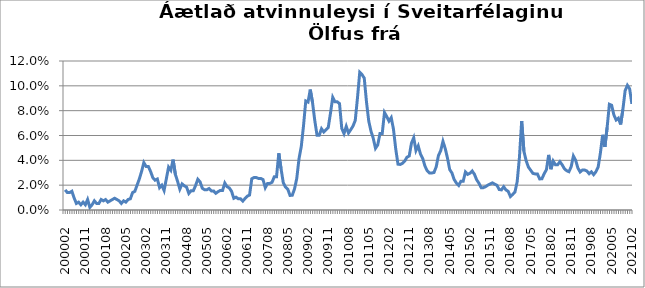
| Category | Series 0 |
|---|---|
| 200002 | 0.016 |
| 200003 | 0.014 |
| 200004 | 0.014 |
| 200005 | 0.015 |
| 200006 | 0.01 |
| 200007 | 0.005 |
| 200008 | 0.006 |
| 200009 | 0.004 |
| 200010 | 0.006 |
| 200011 | 0.004 |
| 200012 | 0.008 |
| 200101 | 0.002 |
| 200102 | 0.004 |
| 200103 | 0.007 |
| 200104 | 0.005 |
| 200105 | 0.005 |
| 200106 | 0.008 |
| 200107 | 0.007 |
| 200108 | 0.008 |
| 200109 | 0.006 |
| 200110 | 0.007 |
| 200111 | 0.008 |
| 200112 | 0.009 |
| 200201 | 0.008 |
| 200202 | 0.007 |
| 200203 | 0.005 |
| 200204 | 0.007 |
| 200205 | 0.006 |
| 200206 | 0.008 |
| 200207 | 0.009 |
| 200208 | 0.014 |
| 200209 | 0.015 |
| 200210 | 0.02 |
| 200211 | 0.025 |
| 200212 | 0.031 |
| 200301 | 0.038 |
| 200302 | 0.035 |
| 200303 | 0.035 |
| 200304 | 0.031 |
| 200305 | 0.026 |
| 200306 | 0.024 |
| 200307 | 0.025 |
| 200308 | 0.018 |
| 200309 | 0.02 |
| 200310 | 0.016 |
| 200311 | 0.025 |
| 200312 | 0.035 |
| 200401 | 0.032 |
| 200402 | 0.041 |
| 200403 | 0.029 |
| 200404 | 0.023 |
| 200405 | 0.017 |
| 200406 | 0.021 |
| 200407 | 0.019 |
| 200408 | 0.018 |
| 200409 | 0.013 |
| 200410 | 0.016 |
| 200411 | 0.016 |
| 200412 | 0.02 |
| 200501 | 0.025 |
| 200502 | 0.023 |
| 200503 | 0.018 |
| 200504 | 0.016 |
| 200505 | 0.016 |
| 200506 | 0.017 |
| 200507 | 0.015 |
| 200508 | 0.015 |
| 200509 | 0.013 |
| 200510 | 0.015 |
| 200511 | 0.016 |
| 200512 | 0.016 |
| 200601 | 0.022 |
| 200602 | 0.019 |
| 200603 | 0.018 |
| 200604 | 0.015 |
| 200605 | 0.009 |
| 200606 | 0.01 |
| 200607 | 0.009 |
| 200608 | 0.009 |
| 200609 | 0.007 |
| 200610 | 0.009 |
| 200611 | 0.011 |
| 200612 | 0.012 |
| 200701 | 0.025 |
| 200702 | 0.026 |
| 200703 | 0.026 |
| 200704 | 0.025 |
| 200705 | 0.025 |
| 200706 | 0.024 |
| 200707 | 0.018 |
| 200708 | 0.021 |
| 200709 | 0.021 |
| 200710 | 0.022 |
| 200711 | 0.027 |
| 200712 | 0.027 |
| 200801 | 0.046 |
| 200802 | 0.033 |
| 200803 | 0.022 |
| 200804 | 0.018 |
| 200805 | 0.017 |
| 200806 | 0.012 |
| 200807 | 0.012 |
| 200808 | 0.017 |
| 200809 | 0.025 |
| 200810 | 0.041 |
| 200811 | 0.051 |
| 200812 | 0.068 |
| 200901 | 0.088 |
| 200902 | 0.087 |
| 200903 | 0.097 |
| 200904 | 0.087 |
| 200905 | 0.072 |
| 200906 | 0.06 |
| 200907 | 0.06 |
| 200908 | 0.065 |
| 200909 | 0.063 |
| 200910 | 0.065 |
| 200911 | 0.066 |
| 200912 | 0.078 |
| 201001 | 0.091 |
| 201002 | 0.087 |
| 201003 | 0.087 |
| 201004 | 0.086 |
| 201005 | 0.066 |
| 201006 | 0.061 |
| 201007 | 0.067 |
| 201008 | 0.062 |
| 201009 | 0.065 |
| 201010 | 0.068 |
| 201011 | 0.072 |
| 201012 | 0.09 |
| 201101 | 0.111 |
| 201102 | 0.109 |
| 201103 | 0.106 |
| 201104 | 0.087 |
| 201105 | 0.072 |
| 201106 | 0.063 |
| 201107 | 0.058 |
| 201108 | 0.05 |
| 201109 | 0.052 |
| 201110 | 0.062 |
| 201111 | 0.062 |
| 201112 | 0.079 |
| 201201 | 0.075 |
| 201202 | 0.072 |
| 201203 | 0.074 |
| 201204 | 0.065 |
| 201205 | 0.049 |
| 201206 | 0.037 |
| 201207 | 0.037 |
| 201208 | 0.038 |
| 201209 | 0.039 |
| 201210 | 0.043 |
| 201211 | 0.043 |
| 201212 | 0.054 |
| 201301 | 0.058 |
| 201302 | 0.048 |
| 201303 | 0.052 |
| 201304 | 0.045 |
| 201305 | 0.042 |
| 201306 | 0.035 |
| 201307 | 0.032 |
| 201308 | 0.03 |
| 201309 | 0.03 |
| 201310 | 0.03 |
| 201311 | 0.035 |
| 201312 | 0.044 |
| 201401 | 0.048 |
| 201402 | 0.055 |
| 201403 | 0.05 |
| 201404 | 0.042 |
| 201405 | 0.033 |
| 201406 | 0.03 |
| 201407 | 0.024 |
| 201408 | 0.022 |
| 201409 | 0.02 |
| 201410 | 0.023 |
| 201411 | 0.023 |
| 201412 | 0.031 |
| 201501 | 0.029 |
| 201502 | 0.03 |
| 201503 | 0.031 |
| 201504 | 0.029 |
| 201505 | 0.024 |
| 201506 | 0.022 |
| 201507 | 0.018 |
| 201508 | 0.018 |
| 201509 | 0.019 |
| 201510 | 0.02 |
| 201511 | 0.021 |
| 201512 | 0.022 |
| 201601 | 0.021 |
| 201602 | 0.02 |
| 201603 | 0.016 |
| 201604 | 0.016 |
| 201605 | 0.019 |
| 201606 | 0.016 |
| 201607 | 0.015 |
| 201608 | 0.011 |
| 201609 | 0.013 |
| 201610 | 0.014 |
| 201611 | 0.023 |
| 201612 | 0.042 |
| 201701 | 0.072 |
| 201702 | 0.047 |
| 201703 | 0.04 |
| 201704 | 0.035 |
| 201705 | 0.032 |
| 201706 | 0.029 |
| 201707 | 0.029 |
| 201708 | 0.029 |
| 201709 | 0.025 |
| 201710 | 0.025 |
| 201711 | 0.029 |
| 201712 | 0.032 |
| 201801 | 0.044 |
| 201802 | 0.033 |
| 201803 | 0.039 |
| 201804 | 0.036 |
| 201805 | 0.036 |
| 201806 | 0.039 |
| 201807 | 0.036 |
| 201808 | 0.033 |
| 201809 | 0.032 |
| 201810 | 0.031 |
| 201811 | 0.035 |
| 201812 | 0.043 |
| 201901 | 0.04 |
| 201902 | 0.034 |
| 201903 | 0.031 |
| 201904 | 0.032 |
| 201905 | 0.032 |
| 201906 | 0.031 |
| 201907 | 0.029 |
| 201908 | 0.031 |
| 201909 | 0.028 |
| 201910 | 0.031 |
| 201911 | 0.035 |
| 201912 | 0.046 |
| 202001 | 0.061 |
| 202002 | 0.051 |
| 202003 | 0.067 |
| 202004 | 0.085 |
| 202005 | 0.084 |
| 202006 | 0.077 |
| 202007 | 0.073 |
| 202008 | 0.074 |
| 202009 | 0.069 |
| 202010 | 0.081 |
| 202011 | 0.096 |
| 202012 | 0.1 |
| 202101 | 0.098 |
| 202102 | 0.085 |